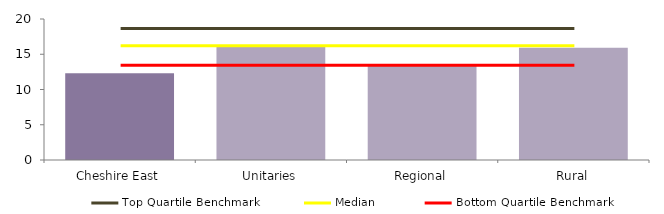
| Category | Block Data |
|---|---|
| Cheshire East | 12.305 |
| Unitaries | 16.218 |
| Regional | 13.527 |
|  Rural  | 15.91 |